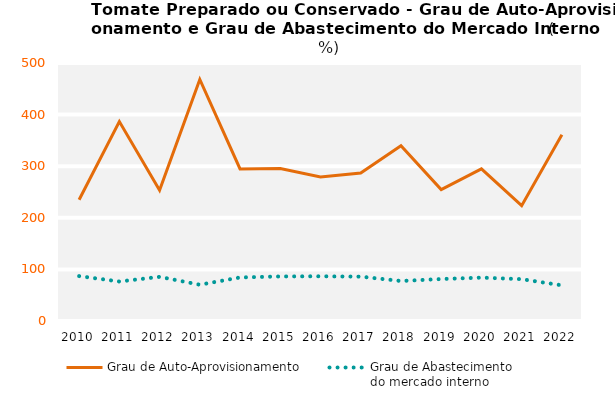
| Category | Grau de Auto-Aprovisionamento | Grau de Abastecimento
do mercado interno |
|---|---|---|
| 2010.0 | 234.908 | 86.98 |
| 2011.0 | 386.449 | 76.556 |
| 2012.0 | 253.486 | 85.554 |
| 2013.0 | 468.252 | 70.292 |
| 2014.0 | 294.678 | 84.367 |
| 2015.0 | 295.473 | 86.382 |
| 2016.0 | 279.018 | 86.632 |
| 2017.0 | 286.766 | 85.965 |
| 2018.0 | 339.648 | 77.543 |
| 2019.0 | 254.622 | 81.333 |
| 2020.0 | 294.74 | 84.067 |
| 2021.0 | 223.58 | 81.09 |
| 2022.0 | 361.109 | 69.116 |